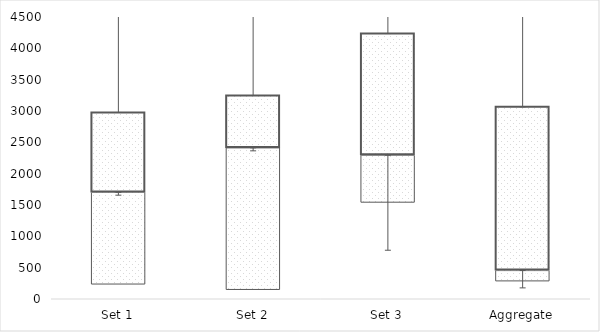
| Category | Q1 | Median-Q1 | Q3-Median |
|---|---|---|---|
| Set 1 | 230.771 | 1469.838 | 1276.898 |
| Set 2 | 144.169 | 2267.223 | 836.6 |
| Set 3 | 1536.667 | 756.863 | 1943.243 |
| Aggregate | 280.866 | 172.657 | 2613.06 |